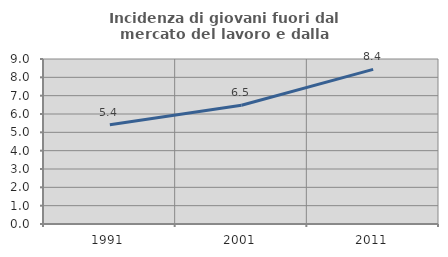
| Category | Incidenza di giovani fuori dal mercato del lavoro e dalla formazione  |
|---|---|
| 1991.0 | 5.417 |
| 2001.0 | 6.477 |
| 2011.0 | 8.434 |